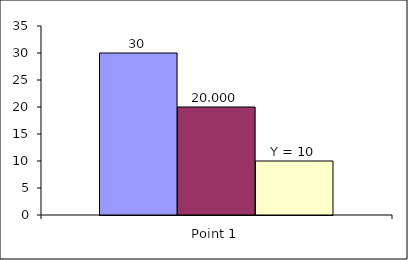
| Category | Series 1 | Series 2 | Series 3 |
|---|---|---|---|
| Point 1 | 30 | 20 | 10 |